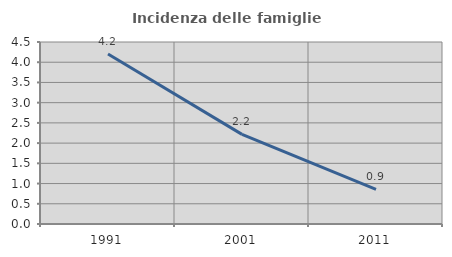
| Category | Incidenza delle famiglie numerose |
|---|---|
| 1991.0 | 4.202 |
| 2001.0 | 2.216 |
| 2011.0 | 0.857 |